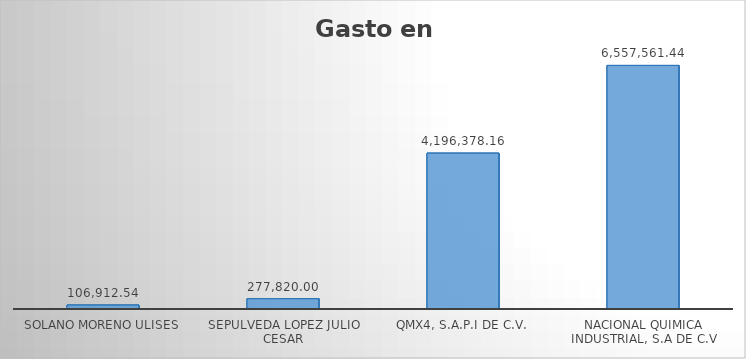
| Category | Suma |
|---|---|
| SOLANO MORENO ULISES | 106912.54 |
| SEPULVEDA LOPEZ JULIO CESAR | 277820 |
| QMX4, S.A.P.I DE C.V. | 4196378.16 |
| NACIONAL QUIMICA INDUSTRIAL, S.A DE C.V | 6557561.44 |